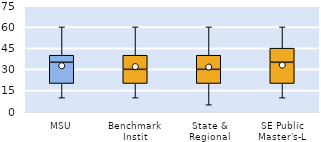
| Category | 25th | 50th | 75th |
|---|---|---|---|
| MSU | 20 | 15 | 5 |
| Benchmark Instit | 20 | 10 | 10 |
| State & Regional | 20 | 10 | 10 |
| SE Public Master's-L | 20 | 15 | 10 |